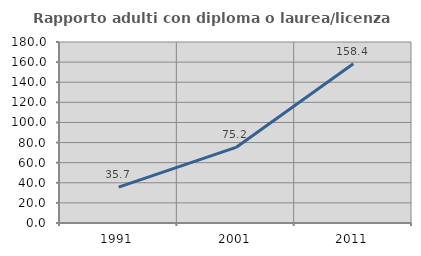
| Category | Rapporto adulti con diploma o laurea/licenza media  |
|---|---|
| 1991.0 | 35.714 |
| 2001.0 | 75.163 |
| 2011.0 | 158.394 |